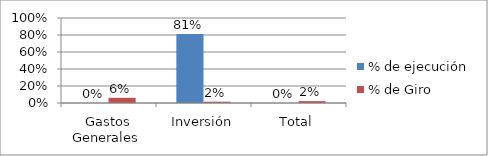
| Category | % de ejecución | % de Giro |
|---|---|---|
| Gastos Generales  | 0 | 0.061 |
| Inversión | 0.811 | 0.015 |
| Total | 0 | 0.022 |